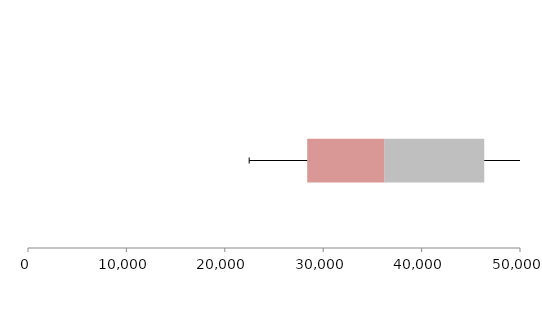
| Category | Series 1 | Series 2 | Series 3 |
|---|---|---|---|
| 0 | 28375.121 | 7867.198 | 10123.211 |